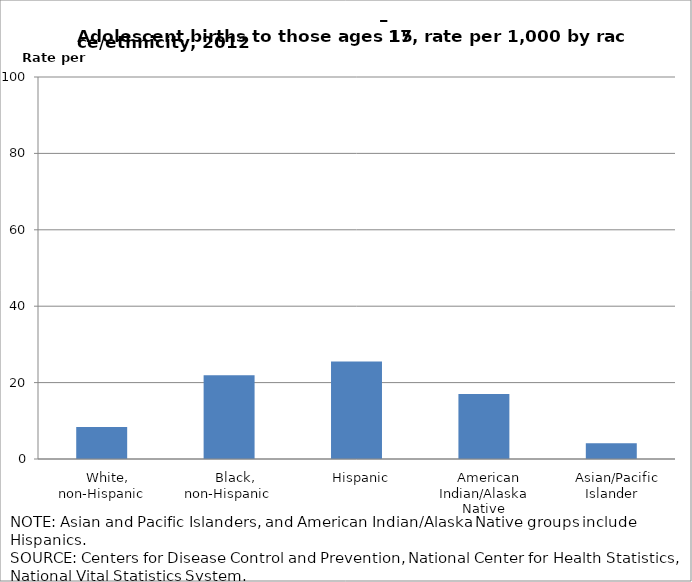
| Category | Series 1 |
|---|---|
|    White, non-Hispanic | 8.4 |
|    Black, non-Hispanic  | 21.9 |
|    Hispanic | 25.5 |
|    American Indian/Alaska Native | 17 |
|    Asian/Pacific Islander | 4.1 |